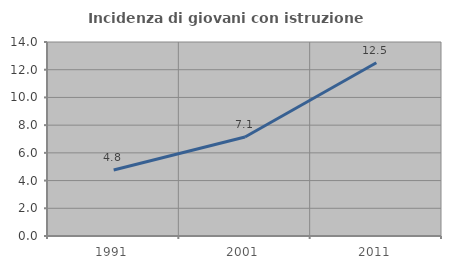
| Category | Incidenza di giovani con istruzione universitaria |
|---|---|
| 1991.0 | 4.762 |
| 2001.0 | 7.143 |
| 2011.0 | 12.5 |